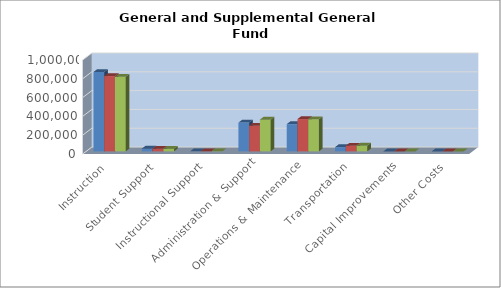
| Category | 2014-2015 | 2015-2016 | 2016-2017 |
|---|---|---|---|
| Instruction | 844595 | 800823 | 794084 |
| Student Support | 29337 | 28974 | 27400 |
| Instructional Support | 1043 | 2362 | 2385 |
| Administration & Support | 306439 | 273326 | 337715 |
| Operations & Maintenance | 289940 | 343842 | 342450 |
| Transportation | 45602 | 60144 | 61000 |
| Capital Improvements | 0 | 0 | 0 |
| Other Costs | 0 | 0 | 0 |